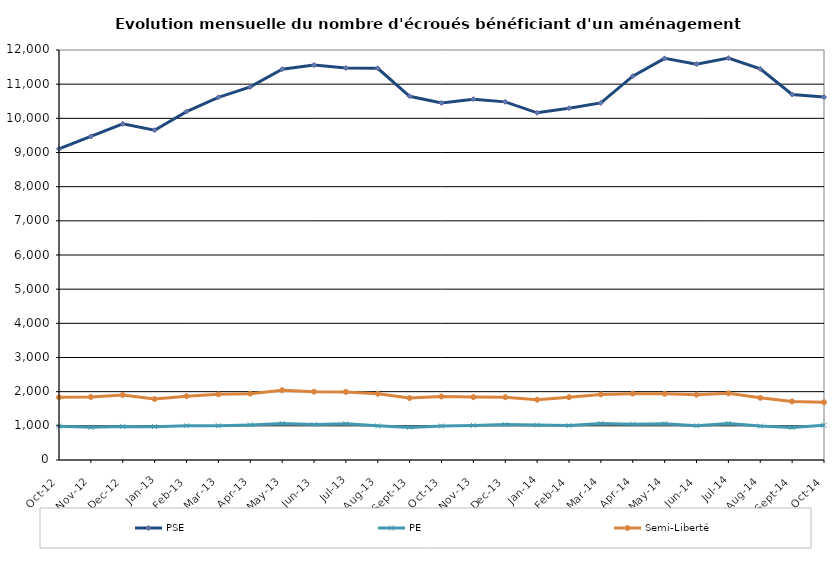
| Category | PSE | PE | Semi-Liberté |
|---|---|---|---|
| 2012-10-01 | 9105 | 988 | 1834 |
| 2012-11-01 | 9470 | 955 | 1845 |
| 2012-12-01 | 9840 | 984 | 1903 |
| 2013-01-01 | 9653 | 976 | 1785 |
| 2013-02-01 | 10197 | 1002 | 1867 |
| 2013-03-01 | 10615 | 1002 | 1921 |
| 2013-04-01 | 10919 | 1027 | 1942 |
| 2013-05-01 | 11438 | 1070 | 2041 |
| 2013-06-01 | 11559 | 1038 | 2000 |
| 2013-07-01 | 11475 | 1061 | 1993 |
| 2013-08-01 | 11465 | 999 | 1939 |
| 2013-09-01 | 10646 | 954 | 1813 |
| 2013-10-01 | 10451 | 993 | 1860 |
| 2013-11-01 | 10560 | 1013 | 1842 |
| 2013-12-01 | 10482 | 1037 | 1838 |
| 2014-01-01 | 10161 | 1022 | 1765 |
| 2014-02-01 | 10296 | 1007 | 1838 |
| 2014-03-01 | 10452 | 1071 | 1920 |
| 2014-04-01 | 11234 | 1050 | 1942 |
| 2014-05-01 | 11755 | 1062 | 1937 |
| 2014-06-01 | 11586 | 1005 | 1912 |
| 2014-07-01 | 11763 | 1068 | 1951 |
| 2014-08-01 | 11447 | 992 | 1820 |
| 2014-09-01 | 10698 | 951 | 1714 |
| 2014-10-01 | 10622 | 1018 | 1692 |